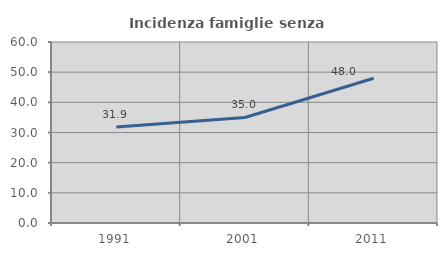
| Category | Incidenza famiglie senza nuclei |
|---|---|
| 1991.0 | 31.85 |
| 2001.0 | 34.988 |
| 2011.0 | 47.989 |